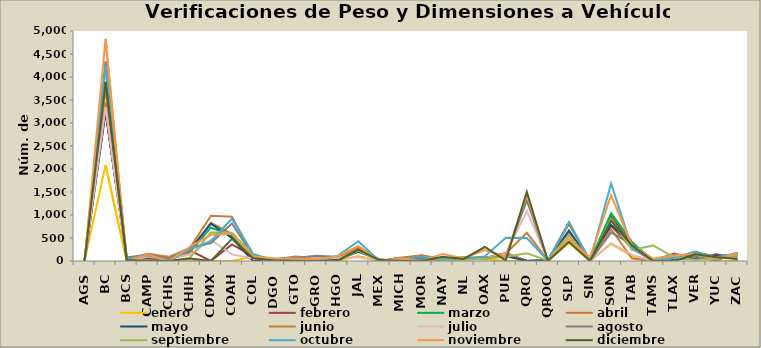
| Category | enero | febrero | marzo | abril | mayo | junio | julio | agosto | septiembre | octubre | noviembre | diciembre |
|---|---|---|---|---|---|---|---|---|---|---|---|---|
| AGS | 0 | 0 | 0 | 0 | 0 | 0 | 0 | 0 | 0 | 0 | 0 | 0 |
| BC | 2088 | 3259 | 3857 | 3446 | 3253 | 3730 | 3341 | 4336 | 4197 | 4258 | 4830 | 3895 |
| BCS | 0 | 52 | 50 | 45 | 66 | 16 | 0 | 78 | 30 | 42 | 0 | 24 |
| CAMP | 50 | 50 | 92 | 93 | 90 | 157 | 99 | 139 | 10 | 125 | 140 | 0 |
| CHIS | 0 | 0 | 58 | 31 | 64 | 91 | 54 | 47 | 0 | 0 | 0 | 0 |
| CHIH | 0 | 232 | 187 | 193 | 246 | 279 | 137 | 288 | 67 | 254 | 310 | 52 |
| CDMX | 0 | 0 | 729 | 833 | 814 | 984 | 457 | 390 | 622 | 431 | 569 | 0 |
| COAH | 0 | 361 | 540 | 591 | 501 | 963 | 144 | 815 | 612 | 918 | 593 | 483 |
| COL | 100 | 100 | 100 | 100 | 0 | 115 | 60 | 112 | 140 | 155 | 100 | 60 |
| DGO | 20 | 25 | 16 | 16 | 22 | 35 | 0 | 22 | 8 | 10 | 61 | 10 |
| GTO | 0 | 83 | 0 | 33 | 61 | 97 | 63 | 66 | 25 | 35 | 56 | 0 |
| GRO | 42 | 56 | 60 | 22 | 71 | 58 | 62 | 116 | 23 | 0 | 39 | 0 |
| HGO | 0 | 0 | 21 | 0 | 26 | 88 | 63 | 95 | 0 | 108 | 99 | 0 |
| JAL | 108 | 263 | 240 | 258 | 200 | 278 | 80 | 320 | 225 | 430 | 323 | 246 |
| MEX | 0 | 0 | 0 | 0 | 30 | 18 | 0 | 31 | 0 | 0 | 0 | 20 |
| MICH | 0 | 68 | 0 | 71 | 0 | 0 | 38 | 0 | 0 | 33 | 58 | 0 |
| MOR | 0 | 0 | 70 | 125 | 50 | 117 | 0 | 45 | 0 | 98 | 0 | 0 |
| NAY | 0 | 33 | 61 | 46 | 52 | 0 | 0 | 45 | 21 | 52 | 154 | 94 |
| NL | 35 | 66 | 77 | 48 | 64 | 80 | 62 | 65 | 34 | 58 | 59 | 44 |
| OAX | 46 | 66 | 40 | 50 | 69 | 53 | 59 | 58 | 50 | 100 | 238 | 304 |
| PUE | 0 | 175 | 159 | 166 | 110 | 163 | 156 | 107 | 90 | 503 | 94 | 14 |
| QRO | 0 | 0 | 0 | 0 | 0 | 613 | 1088 | 1312 | 169 | 500 | 1435 | 1500 |
| QROO | 0 | 20 | 16 | 22 | 12 | 16 | 19 | 10 | 12 | 10 | 10 | 0 |
| SLP | 389 | 550 | 658 | 620 | 660 | 798 | 511 | 840 | 575 | 840 | 480 | 416 |
| SIN | 0 | 0 | 0 | 0 | 0 | 0 | 0 | 0 | 0 | 0 | 81 | 0 |
| SON | 372 | 969 | 1037 | 760 | 784 | 691 | 389 | 618 | 912 | 1684 | 1431 | 873 |
| TAB | 104 | 338 | 410 | 265 | 346 | 54 | 134 | 369 | 240 | 270 | 326 | 329 |
| TAMS | 0 | 0 | 0 | 0 | 0 | 0 | 0 | 33 | 339 | 0 | 51 | 0 |
| TLAX | 0 | 160 | 69 | 78 | 50 | 111 | 73 | 139 | 73 | 69 | 122 | 0 |
| VER | 200 | 44 | 112 | 189 | 50 | 117 | 122 | 91 | 28 | 206 | 152 | 144 |
| YUC | 0 | 148 | 108 | 100 | 118 | 85 | 66 | 15 | 47 | 69 | 45 | 84 |
| ZAC | 0 | 25 | 99 | 119 | 126 | 147 | 53 | 170 | 123 | 180 | 169 | 51 |